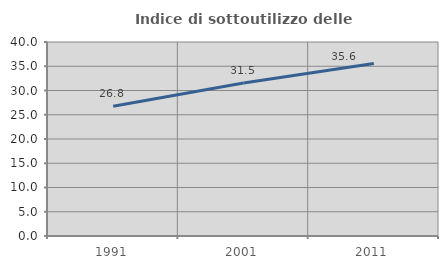
| Category | Indice di sottoutilizzo delle abitazioni  |
|---|---|
| 1991.0 | 26.751 |
| 2001.0 | 31.533 |
| 2011.0 | 35.564 |